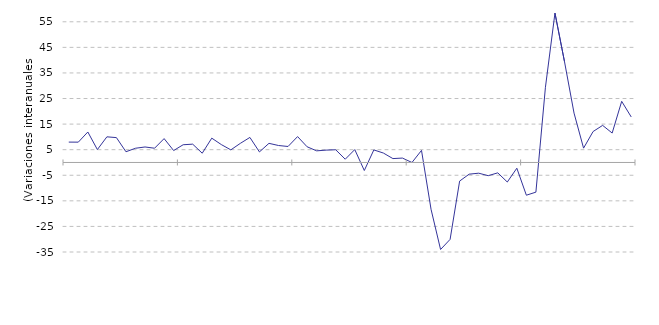
| Category | La Rioja |
|---|---|
| nan | 7.962 |
| nan | 7.943 |
| nan | 11.919 |
| nan | 5.043 |
| 2017.0 | 10.026 |
| nan | 9.716 |
| nan | 4.189 |
| nan | 5.563 |
| nan | 6.06 |
| nan | 5.572 |
| nan | 9.333 |
| nan | 4.667 |
| nan | 6.93 |
| nan | 7.16 |
| nan | 3.62 |
| nan | 9.51 |
| 2018.0 | 7 |
| nan | 4.93 |
| nan | 7.48 |
| nan | 9.79 |
| nan | 4.13 |
| nan | 7.48 |
| nan | 6.63 |
| nan | 6.25 |
| nan | 10.12 |
| nan | 6.14 |
| nan | 4.55 |
| nan | 4.83 |
| 2019.0 | 4.97 |
| nan | 1.27 |
| nan | 5.04 |
| nan | -3.14 |
| nan | 4.91 |
| nan | 3.69 |
| nan | 1.52 |
| nan | 1.72 |
| nan | -0.01 |
| nan | 4.72 |
| nan | -18.29 |
| nan | -34.02 |
| 2020.0 | -30.06 |
| nan | -7.27 |
| nan | -4.57 |
| nan | -4.19 |
| nan | -5.16 |
| nan | -4.06 |
| nan | -7.64 |
| nan | -2.24 |
| nan | -12.8 |
| nan | -11.6 |
| nan | 29.4 |
| nan | 58.4 |
| 2021.0 | 39.4 |
| nan | 19.3 |
| nan | 5.6 |
| nan | 12.1 |
| nan | 14.5 |
| nan | 11.5 |
| nan | 23.9 |